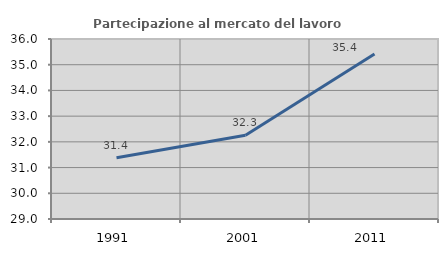
| Category | Partecipazione al mercato del lavoro  femminile |
|---|---|
| 1991.0 | 31.385 |
| 2001.0 | 32.258 |
| 2011.0 | 35.417 |